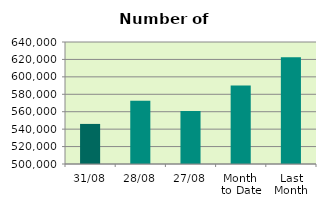
| Category | Series 0 |
|---|---|
| 31/08 | 545996 |
| 28/08 | 572552 |
| 27/08 | 560924 |
| Month 
to Date | 590023.333 |
| Last
Month | 622411.826 |